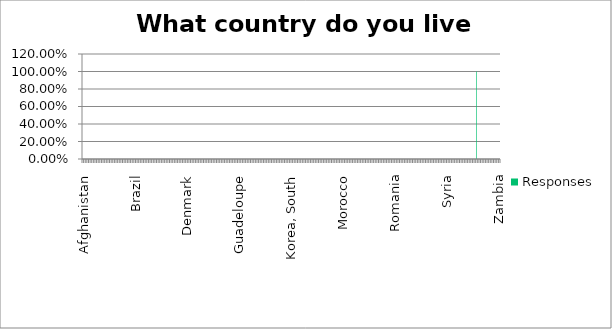
| Category | Responses |
|---|---|
| Afghanistan | 0 |
| Akrotiri | 0 |
| Albania | 0 |
| Algeria | 0 |
| American Samoa | 0 |
| Andorra | 0 |
| Angola | 0 |
| Anguilla | 0 |
| Antarctica | 0 |
| Antigua and Barbuda | 0 |
| Argentina | 0 |
| Armenia | 0 |
| Aruba | 0 |
| Ashmore and Cartier Islands | 0 |
| Australia | 0 |
| Austria | 0 |
| Azerbaijan | 0 |
| Bahamas, The | 0 |
| Bahrain | 0 |
| Bangladesh | 0 |
| Barbados | 0 |
| Bassas da India | 0 |
| Belarus | 0 |
| Belgium | 0 |
| Belize | 0 |
| Benin | 0 |
| Bermuda | 0 |
| Bhutan | 0 |
| Bolivia | 0 |
| Bosnia and Herzegovina | 0 |
| Botswana | 0 |
| Bouvet Island | 0 |
| Brazil | 0 |
| British Indian Ocean Territory | 0 |
| British Virgin Islands | 0 |
| Brunei | 0 |
| Bulgaria | 0 |
| Burkina Faso | 0 |
| Burma | 0 |
| Burundi | 0 |
| Cambodia | 0 |
| Cameroon | 0 |
| Canada | 0 |
| Cape Verde | 0 |
| Cayman Islands | 0 |
| Central African Republic | 0 |
| Chad | 0 |
| Chile | 0 |
| China | 0 |
| Christmas Island | 0 |
| Clipperton Island | 0 |
| Cocos (Keeling) Islands | 0 |
| Colombia | 0 |
| Comoros | 0 |
| Congo, Democratic Republic of the | 0 |
| Congo, Republic of the | 0 |
| Cook Islands | 0 |
| Coral Sea Islands | 0 |
| Costa Rica | 0 |
| Cote d'Ivoire | 0 |
| Croatia | 0 |
| Cuba | 0 |
| Cyprus | 0 |
| Czech Republic | 0 |
| Denmark | 0 |
| Dhekelia | 0 |
| Djibouti | 0 |
| Dominica | 0 |
| Dominican Republic | 0 |
| Ecuador | 0 |
| Egypt | 0 |
| El Salvador | 0 |
| Equatorial Guinea | 0 |
| Eritrea | 0 |
| Estonia | 0 |
| Ethiopia | 0 |
| Europa Island | 0 |
| Falkland Islands (Islas Malvinas) | 0 |
| Faroe Islands | 0 |
| Fiji | 0 |
| Finland | 0 |
| France | 0 |
| French Guiana | 0 |
| French Polynesia | 0 |
| French Southern and Antarctic Lands | 0 |
| Gabon | 0 |
| Gambia, The | 0 |
| Gaza Strip | 0 |
| Georgia | 0 |
| Germany | 0 |
| Ghana | 0 |
| Gibraltar | 0 |
| Glorioso Islands | 0 |
| Greece | 0 |
| Greenland | 0 |
| Grenada | 0 |
| Guadeloupe | 0 |
| Guam | 0 |
| Guatemala | 0 |
| Guernsey | 0 |
| Guinea | 0 |
| GuineaBissau | 0 |
| Guyana | 0 |
| Haiti | 0 |
| Heard Island and McDonald Islands | 0 |
| Holy See (Vatican City) | 0 |
| Honduras | 0 |
| Hong Kong | 0 |
| Hungary | 0 |
| Iceland | 0 |
| India | 0 |
| Indonesia | 0 |
| Iran | 0 |
| Iraq | 0 |
| Ireland | 0 |
| Isle of Man | 0 |
| Israel | 0 |
| Italy | 0 |
| Jamaica | 0 |
| Jan Mayen | 0 |
| Japan | 0 |
| Jersey | 0 |
| Jordan | 0 |
| Juan de Nova Island | 0 |
| Kazakhstan | 0 |
| Kenya | 0 |
| Kiribati | 0 |
| Korea, North | 0 |
| Korea, South | 0 |
| Kuwait | 0 |
| Kyrgyzstan | 0 |
| Laos | 0 |
| Latvia | 0 |
| Lebanon | 0 |
| Lesotho | 0 |
| Liberia | 0 |
| Libya | 0 |
| Liechtenstein | 0 |
| Lithuania | 0 |
| Luxembourg | 0 |
| Macau | 0 |
| Macedonia | 0 |
| Madagascar | 0 |
| Malawi | 0 |
| Malaysia | 0 |
| Maldives | 0 |
| Mali | 0 |
| Malta | 0 |
| Marshall Islands | 0 |
| Martinique | 0 |
| Mauritania | 0 |
| Mauritius | 0 |
| Mayotte | 0 |
| Mexico | 0 |
| Micronesia, Federated States of | 0 |
| Moldova | 0 |
| Monaco | 0 |
| Mongolia | 0 |
| Montenegro | 0 |
| Montserrat | 0 |
| Morocco | 0 |
| Mozambique | 0 |
| Namibia | 0 |
| Nauru | 0 |
| Navassa Island | 0 |
| Nepal | 0 |
| Netherlands | 0 |
| Netherlands Antilles | 0 |
| New Caledonia | 0 |
| New Zealand | 0 |
| Nicaragua | 0 |
| Niger | 0 |
| Nigeria | 0 |
| Niue | 0 |
| Norfolk Island | 0 |
| Northern Mariana Islands | 0 |
| Norway | 0 |
| Oman | 0 |
| Pakistan | 0 |
| Palau | 0 |
| Panama | 0 |
| Papua New Guinea | 0 |
| Paracel Islands | 0 |
| Paraguay | 0 |
| Peru | 0 |
| Philippines | 0 |
| Pitcairn Islands | 0 |
| Poland | 0 |
| Portugal | 0 |
| Puerto Rico | 0 |
| Qatar | 0 |
| Reunion | 0 |
| Romania | 0 |
| Russia | 0 |
| Rwanda | 0 |
| Saint Helena | 0 |
| Saint Kitts and Nevis | 0 |
| Saint Lucia | 0 |
| Saint Pierre and Miquelon | 0 |
| Saint Vincent and the Grenadines | 0 |
| Samoa | 0 |
| San Marino | 0 |
| Sao Tome and Principe | 0 |
| Saudi Arabia | 0 |
| Senegal | 0 |
| Serbia | 0 |
| Seychelles | 0 |
| Sierra Leone | 0 |
| Singapore | 0 |
| Slovakia | 0 |
| Slovenia | 0 |
| Solomon Islands | 0 |
| Somalia | 0 |
| South Africa | 0 |
| South Georgia and the South Sandwich Islands | 0 |
| Spain | 0 |
| Spratly Islands | 0 |
| Sri Lanka | 0 |
| Sudan | 0 |
| Suriname | 0 |
| Svalbard | 0 |
| Swaziland | 0 |
| Sweden | 0 |
| Switzerland | 0 |
| Syria | 0 |
| Taiwan | 0 |
| Tajikistan | 0 |
| Tanzania | 0 |
| Thailand | 0 |
| TimorLeste | 0 |
| Togo | 0 |
| Tokelau | 0 |
| Tonga | 0 |
| Trinidad and Tobago | 0 |
| Tromelin Island | 0 |
| Tunisia | 0 |
| Turkey | 0 |
| Turkmenistan | 0 |
| Turks and Caicos Islands | 0 |
| Tuvalu | 0 |
| Uganda | 0 |
| Ukraine | 0 |
| United Arab Emirates | 0 |
| United Kingdom | 1 |
| United States | 0 |
| Uruguay | 0 |
| Uzbekistan | 0 |
| Vanuatu | 0 |
| Venezuela | 0 |
| Vietnam | 0 |
| Virgin Islands | 0 |
| Wake Island | 0 |
| Wallis and Futuna | 0 |
| West Bank | 0 |
| Western Sahara | 0 |
| Yemen | 0 |
| Zambia | 0 |
| Zimbabwe | 0 |